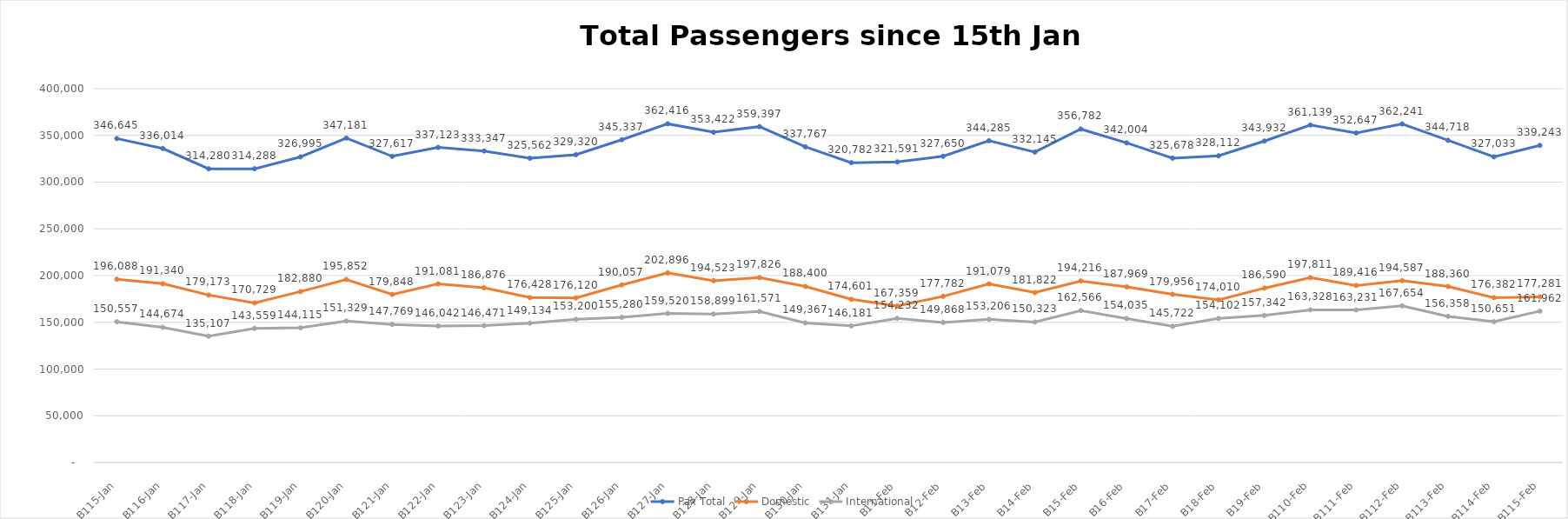
| Category | Pax Total |  Domestic  |  International  |
|---|---|---|---|
| 2023-01-15 | 346645 | 196088 | 150557 |
| 2023-01-16 | 336014 | 191340 | 144674 |
| 2023-01-17 | 314280 | 179173 | 135107 |
| 2023-01-18 | 314288 | 170729 | 143559 |
| 2023-01-19 | 326995 | 182880 | 144115 |
| 2023-01-20 | 347181 | 195852 | 151329 |
| 2023-01-21 | 327617 | 179848 | 147769 |
| 2023-01-22 | 337123 | 191081 | 146042 |
| 2023-01-23 | 333347 | 186876 | 146471 |
| 2023-01-24 | 325562 | 176428 | 149134 |
| 2023-01-25 | 329320 | 176120 | 153200 |
| 2023-01-26 | 345337 | 190057 | 155280 |
| 2023-01-27 | 362416 | 202896 | 159520 |
| 2023-01-28 | 353422 | 194523 | 158899 |
| 2023-01-29 | 359397 | 197826 | 161571 |
| 2023-01-30 | 337767 | 188400 | 149367 |
| 2023-01-31 | 320782 | 174601 | 146181 |
| 2023-02-01 | 321591 | 167359 | 154232 |
| 2023-02-02 | 327650 | 177782 | 149868 |
| 2023-02-03 | 344285 | 191079 | 153206 |
| 2023-02-04 | 332145 | 181822 | 150323 |
| 2023-02-05 | 356782 | 194216 | 162566 |
| 2023-02-06 | 342004 | 187969 | 154035 |
| 2023-02-07 | 325678 | 179956 | 145722 |
| 2023-02-08 | 328112 | 174010 | 154102 |
| 2023-02-09 | 343932 | 186590 | 157342 |
| 2023-02-10 | 361139 | 197811 | 163328 |
| 2023-02-11 | 352647 | 189416 | 163231 |
| 2023-02-12 | 362241 | 194587 | 167654 |
| 2023-02-13 | 344718 | 188360 | 156358 |
| 2023-02-14 | 327033 | 176382 | 150651 |
| 2023-02-15 | 339243 | 177281 | 161962 |